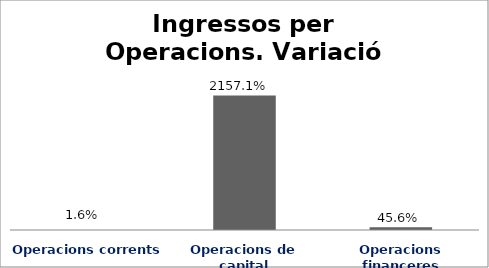
| Category | Series 0 |
|---|---|
| Operacions corrents | 0.016 |
| Operacions de capital | 21.571 |
| Operacions financeres | 0.456 |